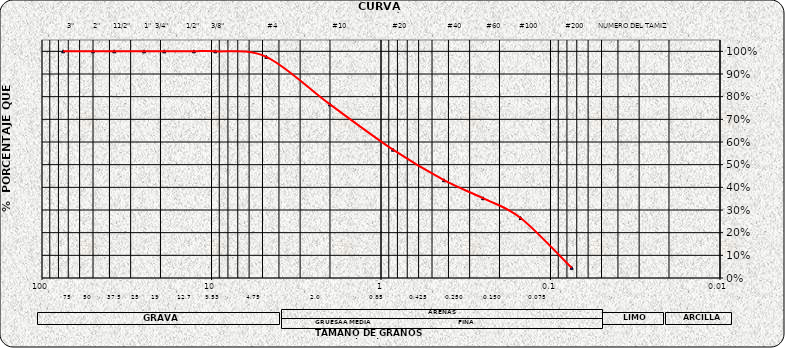
| Category | Series 0 |
|---|---|
| 75.0 | 1 |
| 50.0 | 1 |
| 37.5 | 1 |
| 25.0 | 1 |
| 19.0 | 1 |
| 12.7 | 1 |
| 9.5 | 1 |
| 4.75 | 0.976 |
| 2.0 | 0.766 |
| 0.85 | 0.566 |
| 0.425 | 0.431 |
| 0.25 | 0.352 |
| 0.15 | 0.265 |
| 0.075 | 0.045 |
| nan | 0 |